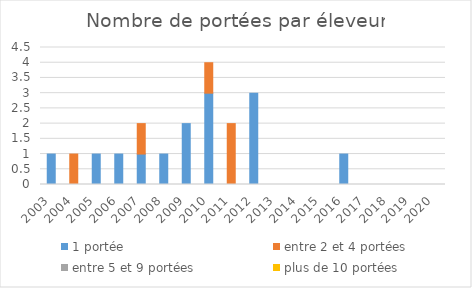
| Category | 1 portée | entre 2 et 4 portées | entre 5 et 9 portées | plus de 10 portées |
|---|---|---|---|---|
| 2003.0 | 1 | 0 | 0 | 0 |
| 2004.0 | 0 | 1 | 0 | 0 |
| 2005.0 | 1 | 0 | 0 | 0 |
| 2006.0 | 1 | 0 | 0 | 0 |
| 2007.0 | 1 | 1 | 0 | 0 |
| 2008.0 | 1 | 0 | 0 | 0 |
| 2009.0 | 2 | 0 | 0 | 0 |
| 2010.0 | 3 | 1 | 0 | 0 |
| 2011.0 | 0 | 2 | 0 | 0 |
| 2012.0 | 3 | 0 | 0 | 0 |
| 2013.0 | 0 | 0 | 0 | 0 |
| 2014.0 | 0 | 0 | 0 | 0 |
| 2015.0 | 0 | 0 | 0 | 0 |
| 2016.0 | 1 | 0 | 0 | 0 |
| 2017.0 | 0 | 0 | 0 | 0 |
| 2018.0 | 0 | 0 | 0 | 0 |
| 2019.0 | 0 | 0 | 0 | 0 |
| 2020.0 | 0 | 0 | 0 | 0 |